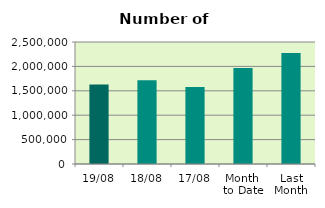
| Category | Series 0 |
|---|---|
| 19/08 | 1631416 |
| 18/08 | 1716264 |
| 17/08 | 1579544 |
| Month 
to Date | 1967811.692 |
| Last
Month | 2275631.565 |